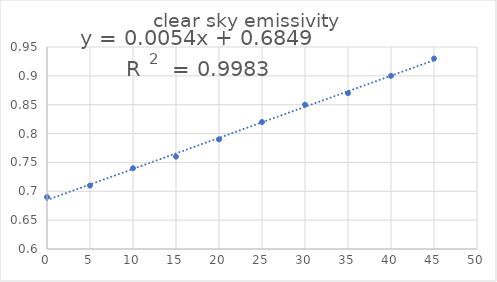
| Category | clear sky emissivity |
|---|---|
| 0.0 | 0.69 |
| 5.0 | 0.71 |
| 10.0 | 0.74 |
| 15.0 | 0.76 |
| 20.0 | 0.79 |
| 25.0 | 0.82 |
| 30.0 | 0.85 |
| 35.0 | 0.87 |
| 40.0 | 0.9 |
| 45.0 | 0.93 |